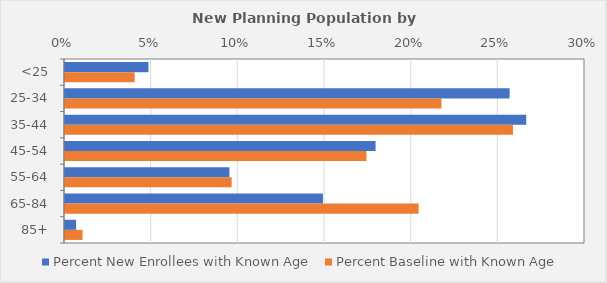
| Category | Percent New Enrollees with Known Age | Percent Baseline with Known Age |
|---|---|---|
| <25 | 0.048 | 0.04 |
| 25-34 | 0.257 | 0.217 |
| 35-44 | 0.266 | 0.258 |
| 45-54 | 0.179 | 0.174 |
| 55-64 | 0.095 | 0.096 |
| 65-84 | 0.149 | 0.204 |
| 85+ | 0.006 | 0.01 |